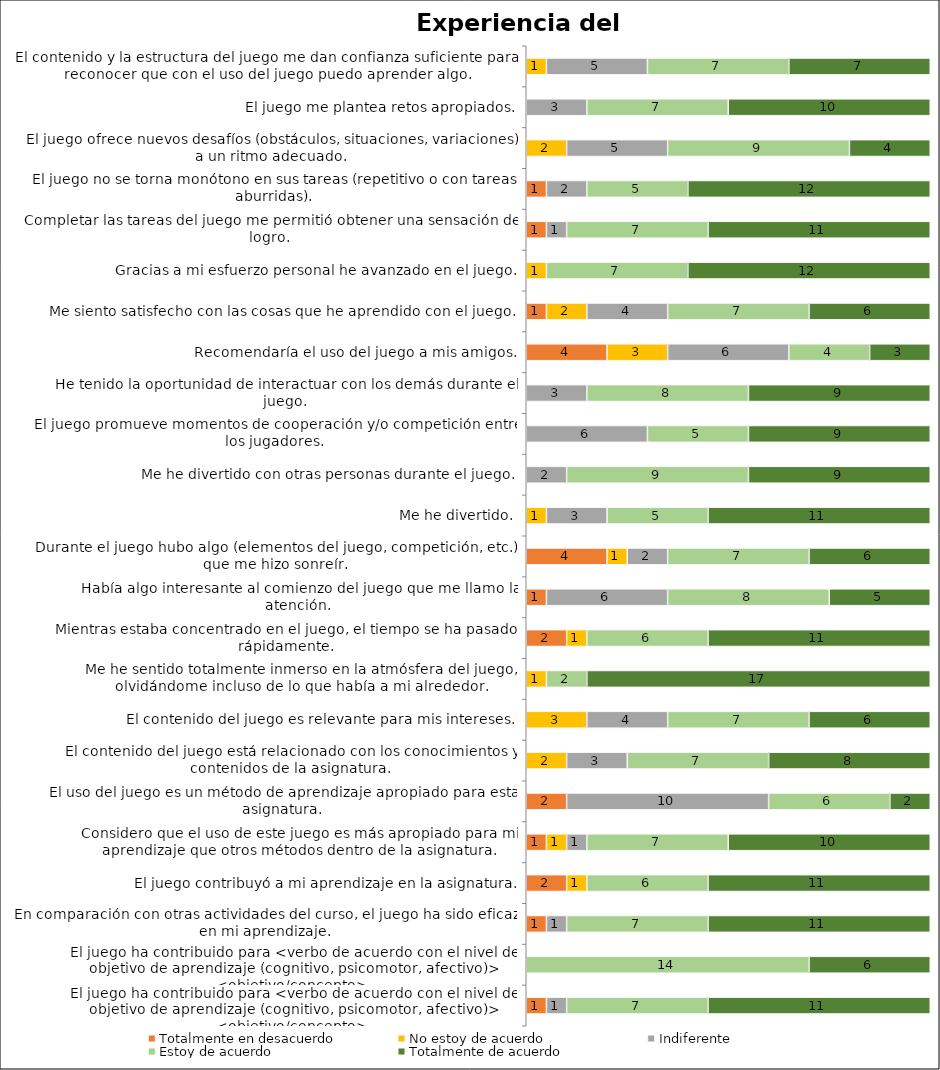
| Category | Totalmente en desacuerdo | No estoy de acuerdo | Indiferente | Estoy de acuerdo | Totalmente de acuerdo |
|---|---|---|---|---|---|
| El contenido y la estructura del juego me dan confianza suficiente para reconocer que con el uso del juego puedo aprender algo. | 0 | 1 | 5 | 7 | 7 |
| El juego me plantea retos apropiados. | 0 | 0 | 3 | 7 | 10 |
| El juego ofrece nuevos desafíos (obstáculos, situaciones, variaciones) a un ritmo adecuado. | 0 | 2 | 5 | 9 | 4 |
| El juego no se torna monótono en sus tareas (repetitivo o con tareas aburridas). | 1 | 0 | 2 | 5 | 12 |
| Completar las tareas del juego me permitió obtener una sensación de logro. | 1 | 0 | 1 | 7 | 11 |
| Gracias a mi esfuerzo personal he avanzado en el juego. | 0 | 1 | 0 | 7 | 12 |
| Me siento satisfecho con las cosas que he aprendido con el juego. | 1 | 2 | 4 | 7 | 6 |
| Recomendaría el uso del juego a mis amigos. | 4 | 3 | 6 | 4 | 3 |
| He tenido la oportunidad de interactuar con los demás durante el juego. | 0 | 0 | 3 | 8 | 9 |
| El juego promueve momentos de cooperación y/o competición entre los jugadores. | 0 | 0 | 6 | 5 | 9 |
| Me he divertido con otras personas durante el juego. | 0 | 0 | 2 | 9 | 9 |
| Me he divertido. | 0 | 1 | 3 | 5 | 11 |
| Durante el juego hubo algo (elementos del juego, competición, etc.) que me hizo sonreír. | 4 | 1 | 2 | 7 | 6 |
| Había algo interesante al comienzo del juego que me llamo la atención. | 1 | 0 | 6 | 8 | 5 |
| Mientras estaba concentrado en el juego, el tiempo se ha pasado rápidamente. | 2 | 1 | 0 | 6 | 11 |
| Me he sentido totalmente inmerso en la atmósfera del juego, olvidándome incluso de lo que había a mi alrededor. | 0 | 1 | 0 | 2 | 17 |
| El contenido del juego es relevante para mis intereses. | 0 | 3 | 4 | 7 | 6 |
| El contenido del juego está relacionado con los conocimientos y contenidos de la asignatura. | 0 | 2 | 3 | 7 | 8 |
| El uso del juego es un método de aprendizaje apropiado para esta asignatura. | 2 | 0 | 10 | 6 | 2 |
| Considero que el uso de este juego es más apropiado para mi aprendizaje que otros métodos dentro de la asignatura. | 1 | 1 | 1 | 7 | 10 |
| El juego contribuyó a mi aprendizaje en la asignatura. | 2 | 1 | 0 | 6 | 11 |
| En comparación con otras actividades del curso, el juego ha sido eficaz en mi aprendizaje. | 1 | 0 | 1 | 7 | 11 |
| El juego ha contribuido para <verbo de acuerdo con el nivel de objetivo de aprendizaje (cognitivo, psicomotor, afectivo)> <objetivo/concepto>. | 0 | 0 | 0 | 14 | 6 |
| El juego ha contribuido para <verbo de acuerdo con el nivel de objetivo de aprendizaje (cognitivo, psicomotor, afectivo)> <objetivo/concepto>. | 1 | 0 | 1 | 7 | 11 |